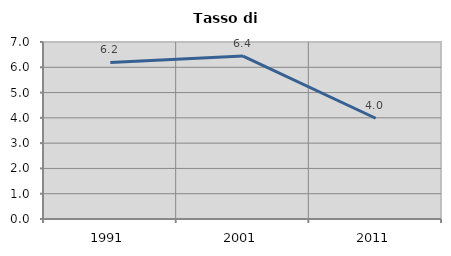
| Category | Tasso di disoccupazione   |
|---|---|
| 1991.0 | 6.193 |
| 2001.0 | 6.444 |
| 2011.0 | 3.984 |